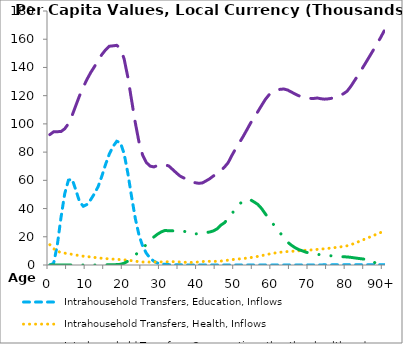
| Category | Intrahousehold Transfers, Education, Inflows | Intrahousehold Transfers, Health, Inflows | Intrahousehold Transfers, Consumption other than health and education, Inflows | Intrahousehold Transfers, Saving, Inflows |
|---|---|---|---|---|
| 0 | 0 | 14363.728 | 92408.788 | 0 |
|  | 1079.685 | 11580.507 | 94387.579 | 0 |
| 2 | 14009.498 | 9835.45 | 94493.545 | 0 |
| 3 | 33703.64 | 8845.878 | 94567.291 | 0 |
| 4 | 50503.753 | 8414.048 | 96514.677 | 0 |
| 5 | 60104.997 | 8015.371 | 100159.482 | 0 |
| 6 | 60798.627 | 7578.809 | 106016.245 | 0 |
| 7 | 53118.468 | 7099.048 | 113056.58 | 0 |
| 8 | 44796.902 | 6611.062 | 120019.304 | 0 |
| 9 | 41628.007 | 6224.988 | 126059.942 | 0 |
| 10 | 42874.087 | 5966.004 | 131564.868 | 0 |
| 11 | 46298.901 | 5678.36 | 136394.406 | 0 |
| 12 | 50546.37 | 5368.945 | 140526.158 | 0.221 |
| 13 | 55587.552 | 5056.866 | 145141.585 | 1.429 |
| 14 | 62966.309 | 4767.243 | 149128.504 | 14.825 |
| 15 | 71305.528 | 4545.259 | 152441.945 | 72.539 |
| 16 | 78630.004 | 4362.29 | 155029.887 | 160.715 |
| 17 | 83921.213 | 4173.258 | 155311.909 | 217.931 |
| 18 | 87668.908 | 4011.411 | 155669.655 | 280.839 |
| 19 | 86752.018 | 3831.639 | 153571.521 | 497.964 |
| 20 | 78793.989 | 3657.136 | 145977.258 | 1265.338 |
| 21 | 64978.895 | 3414.6 | 133035.782 | 2729.574 |
| 22 | 48515.445 | 3075.978 | 116884.027 | 4658.606 |
| 23 | 33038.725 | 2703.689 | 100843.947 | 6966.784 |
| 24 | 21218.768 | 2342.84 | 87101.512 | 9608.77 |
| 25 | 13361.348 | 2126.674 | 77661.091 | 12103.033 |
| 26 | 8243.75 | 2077.058 | 72564.806 | 14472.953 |
| 27 | 4846.151 | 2085.63 | 70090.515 | 17052.623 |
| 28 | 2681.183 | 2127.389 | 69504.975 | 19850.715 |
| 29 | 1343.054 | 2208.865 | 70507.691 | 21874.361 |
| 30 | 728.513 | 2172.364 | 71096.535 | 23436.59 |
| 31 | 496.895 | 2208.528 | 70948.602 | 24501.391 |
| 32 | 276.35 | 2344.398 | 70233.942 | 24239.28 |
| 33 | 132.085 | 2368.104 | 67830.975 | 24208.916 |
| 34 | 89.972 | 2331.349 | 65414.778 | 24366.915 |
| 35 | 100.946 | 2133.786 | 63135.726 | 24240.827 |
| 36 | 96.411 | 1939.577 | 61730.818 | 24130.195 |
| 37 | 50.367 | 1881.58 | 61128.962 | 22865.601 |
| 38 | 9.334 | 1850.752 | 59464.082 | 22111.213 |
| 39 | 3.549 | 1955.459 | 58376.926 | 21969.522 |
| 40 | 32.935 | 2132.206 | 57936.557 | 22199.463 |
| 41 | 70.986 | 2414.72 | 58086.722 | 23168.378 |
| 42 | 75.129 | 2589.424 | 59515.686 | 23020.474 |
| 43 | 64.373 | 2605.3 | 61070.192 | 23356.339 |
| 44 | 28.364 | 2570.785 | 63024.223 | 24132.423 |
| 45 | 4.559 | 2583.874 | 64954.417 | 25561.623 |
| 46 | 0 | 2773.394 | 66759.591 | 28191.799 |
| 47 | 0 | 3106.562 | 69356.953 | 29950.172 |
| 48 | 0 | 3409.064 | 72509.89 | 32772.438 |
| 49 | 0 | 3783.578 | 77602.986 | 36308.735 |
| 50 | 0 | 4091.131 | 82305.324 | 39941.236 |
| 51 | 0 | 4323.153 | 86585.248 | 43096.352 |
| 52 | 0 | 4575.225 | 90892.638 | 45261.23 |
| 53 | 0 | 4853.626 | 95598.365 | 46662.411 |
| 54 | 0 | 5218.626 | 100384.331 | 46244.145 |
| 55 | 0 | 5661.573 | 104695.935 | 44642.119 |
| 56 | 0.039 | 6102.975 | 108698.732 | 42920.049 |
| 57 | 0.196 | 6611.734 | 113043.105 | 40035.933 |
| 58 | 0.394 | 7190.137 | 117269.017 | 36292.221 |
| 59 | 0.52 | 7762.548 | 120570.891 | 32659.399 |
| 60 | 0.561 | 8266.292 | 122670.365 | 29410.443 |
| 61 | 0.559 | 8678.136 | 123771.674 | 26171.162 |
| 62 | 0.556 | 9020.689 | 124518.205 | 22773.182 |
| 63 | 0.986 | 9307.264 | 124706.866 | 19285.483 |
| 64 | 4.58 | 9529.611 | 124008.885 | 16254.381 |
| 65 | 12.401 | 9694.385 | 122624.853 | 14075.111 |
| 66 | 17.785 | 9851.956 | 121210.659 | 12305.951 |
| 67 | 21.387 | 10038.603 | 119954.159 | 10910.288 |
| 68 | 29.61 | 10232.079 | 119003.588 | 10010.952 |
| 69 | 41.532 | 10455.143 | 118328.25 | 9029.281 |
| 70 | 51.221 | 10606.195 | 118100.651 | 8389.64 |
| 71 | 58.344 | 10782.019 | 118013.38 | 7822.033 |
| 72 | 69.909 | 11063.16 | 118332.806 | 7523.416 |
| 73 | 80.861 | 11272.699 | 117813.002 | 7249.559 |
| 74 | 92.451 | 11535.074 | 117529.02 | 6972.84 |
| 75 | 104.623 | 11804.078 | 117761.101 | 6709.134 |
| 76 | 117.387 | 12105.38 | 118217.858 | 6427.316 |
| 77 | 131.084 | 12425.825 | 118956.978 | 6174.596 |
| 78 | 146.753 | 12762.783 | 119990.354 | 5972.028 |
| 79 | 164.955 | 13131.796 | 121291.965 | 5827.972 |
| 80 | 183.329 | 13579.812 | 123107.386 | 5723.274 |
| 81 | 191.002 | 14323.772 | 126477.192 | 5430.79 |
| 82 | 188.206 | 15338.331 | 130532.299 | 5053.793 |
| 83 | 186.278 | 16393.003 | 134601.083 | 4694.031 |
| 84 | 189.813 | 17460.833 | 138807.685 | 4366.578 |
| 85 | 192.463 | 18568.265 | 143157.151 | 3982.755 |
| 86 | 196.976 | 19658.834 | 147511.051 | 3595.041 |
| 87 | 201.81 | 20743.028 | 151912.015 | 3194.915 |
| 88 | 205.967 | 21831.939 | 156378.723 | 0 |
| 89 | 208.824 | 22936.326 | 160929.457 | 0 |
| 90+ | 209.484 | 24124.35 | 165855.713 | 0 |